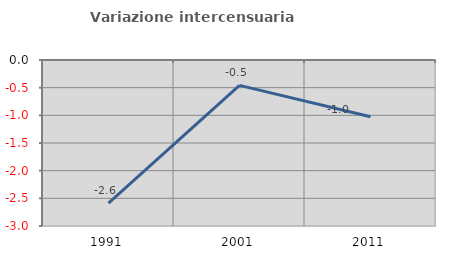
| Category | Variazione intercensuaria annua |
|---|---|
| 1991.0 | -2.586 |
| 2001.0 | -0.458 |
| 2011.0 | -1.027 |